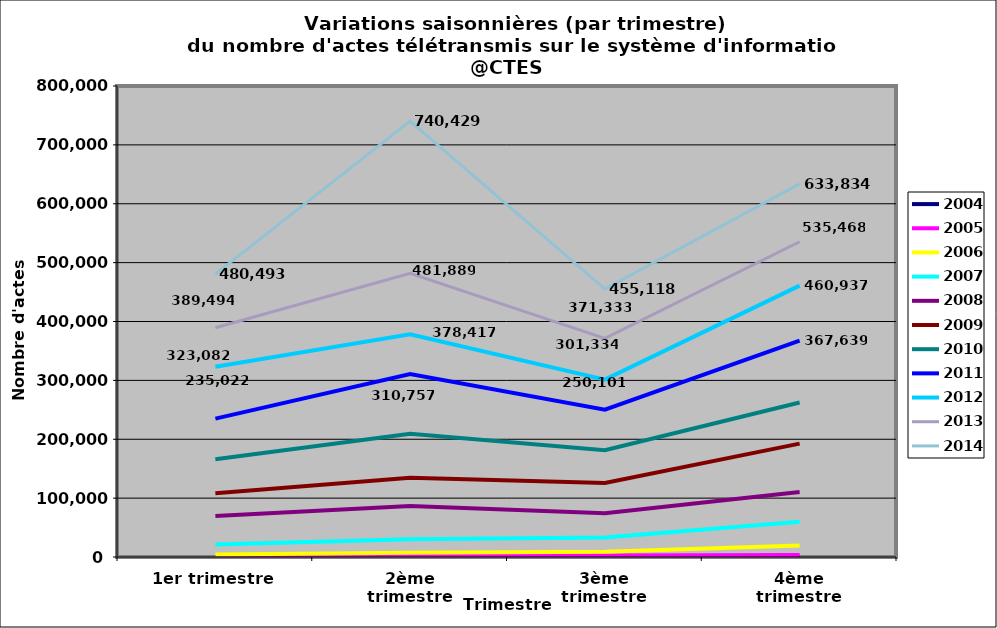
| Category | 2004 | 2005 | 2006 | 2007 | 2008 | 2009 | 2010 | 2011 | 2012 | 2013 | 2014 |
|---|---|---|---|---|---|---|---|---|---|---|---|
| 1er trimestre | 22 | 324 | 4334 | 21337 | 69629 | 108357 | 166072 | 235022 | 323082 | 389494 | 480493 |
| 2ème trimestre | 1 | 1552 | 7105 | 29985 | 86475 | 134526 | 209207 | 310757 | 378417 | 481889 | 740429 |
| 3ème trimestre | 0 | 2393 | 8999 | 33033 | 74156 | 125631 | 181314 | 250101 | 301334 | 371333 | 455118 |
| 4ème trimestre | 54 | 3391 | 19515 | 59957 | 110286 | 192635 | 262476 | 367639 | 460937 | 535468 | 633834 |